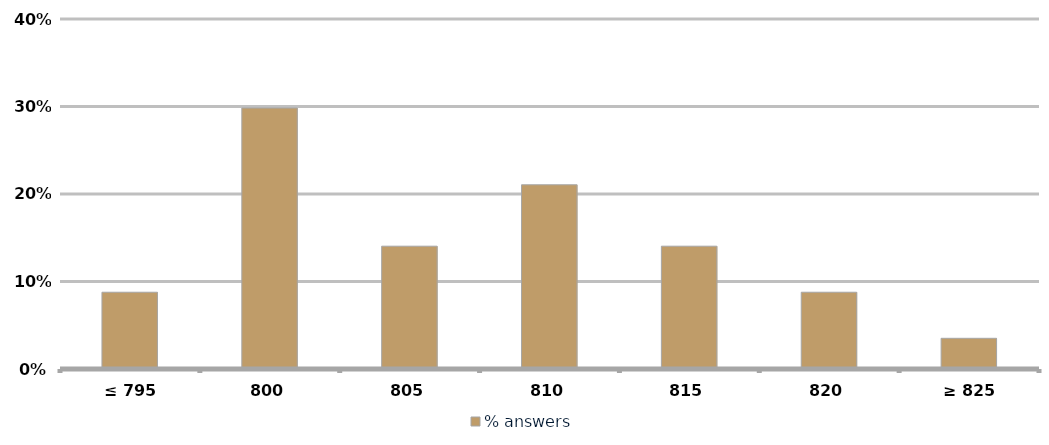
| Category | % answers |
|---|---|
| ≤ 795 | 0.088 |
| 800 | 0.298 |
| 805 | 0.14 |
| 810 | 0.211 |
| 815 | 0.14 |
| 820 | 0.088 |
| ≥ 825 | 0.035 |